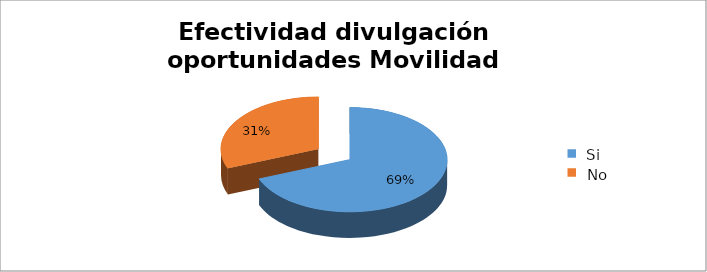
| Category | Series 0 |
|---|---|
| 0 | 0.69 |
| 1 | 0.31 |